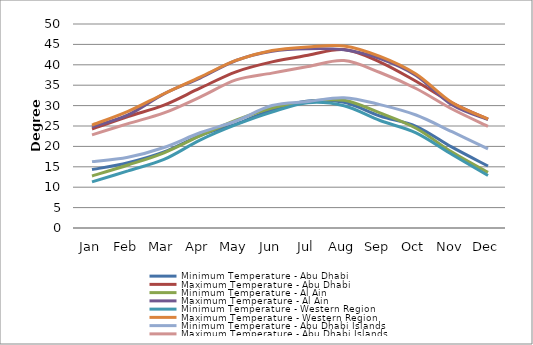
| Category | Minimum Temperature - Abu Dhabi | Maximum Temperature - Abu Dhabi | Minimum Temperature - Al Ain | Maximum Temperature - Al Ain | Minimum Temperature - Western Region | Maximum Temperature - Western Region | Minimum Temperature - Abu Dhabi Islands | Maximum Temperature - Abu Dhabi Islands |
|---|---|---|---|---|---|---|---|---|
| Jan | 14.32 | 24.26 | 12.75 | 24.756 | 11.295 | 25.235 | 16.267 | 22.821 |
| Feb | 15.995 | 27.337 | 15.435 | 27.713 | 14.006 | 28.584 | 17.351 | 25.581 |
| Mar | 18.637 | 30.117 | 18.436 | 32.887 | 16.802 | 32.905 | 19.728 | 28.205 |
| Apr | 22.661 | 34.271 | 22.579 | 36.759 | 21.531 | 36.98 | 23.338 | 32.078 |
| May | 25.474 | 38.282 | 26.405 | 41.053 | 25.313 | 41.068 | 26.228 | 36.297 |
| Jun | 28.968 | 40.717 | 29.419 | 43.313 | 28.412 | 43.492 | 30.007 | 37.957 |
| Jul | 31.13 | 42.324 | 30.939 | 43.933 | 30.716 | 44.372 | 30.989 | 39.581 |
| Aug | 30.823 | 43.726 | 31.316 | 43.665 | 29.956 | 44.616 | 31.937 | 41.038 |
| Sep | 27.45 | 40.683 | 28.216 | 41.536 | 26.343 | 42.057 | 30.245 | 38.113 |
| Oct | 24.931 | 35.965 | 24.448 | 37.401 | 23.319 | 37.732 | 27.692 | 34.192 |
| Nov | 19.809 | 30.699 | 18.593 | 30.195 | 18.016 | 30.758 | 23.596 | 29.159 |
| Dec | 15.188 | 26.663 | 13.62 | 26.553 | 12.882 | 26.712 | 19.403 | 24.93 |